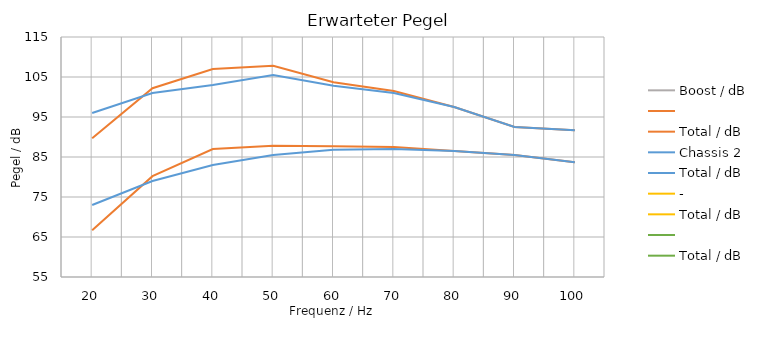
| Category | Boost / dB | Series 1 | Total / dB | Chassis 2 | - | Series 7 |
|---|---|---|---|---|---|---|
| 20.0 | 23 | 66.7 | 43 | 73 | 20 | 20 |
| 30.0 | 22 | 80.2 | 42 | 79 | 20 | 20 |
| 40.0 | 20 | 87 | 40 | 83 | 20 | 20 |
| 50.0 | 20 | 87.8 | 40 | 85.5 | 20 | 20 |
| 60.0 | 16 | 87.7 | 36 | 86.8 | 20 | 20 |
| 70.0 | 14 | 87.5 | 34 | 87 | 20 | 20 |
| 80.0 | 11 | 86.5 | 31 | 86.5 | 20 | 20 |
| 90.0 | 7 | 85.5 | 27 | 85.5 | 20 | 20 |
| 100.0 | 8 | 83.7 | 28 | 83.7 | 20 | 20 |